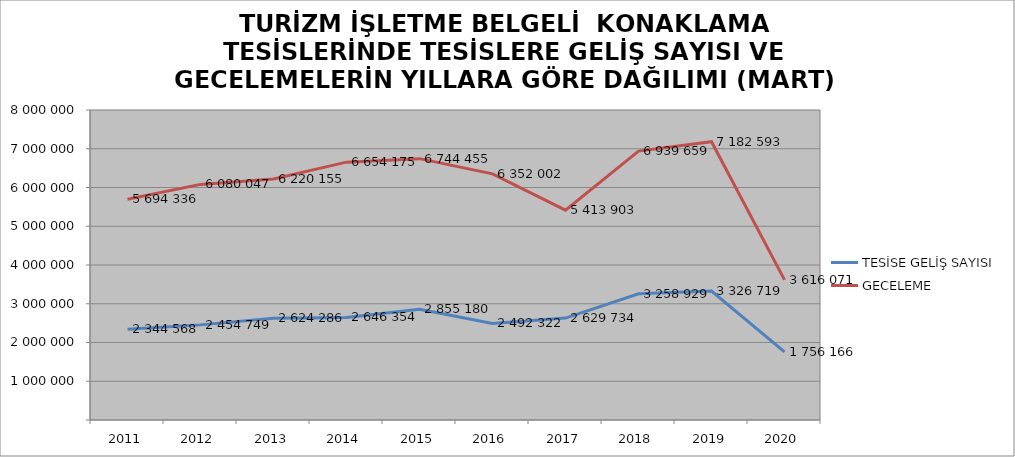
| Category | TESİSE GELİŞ SAYISI | GECELEME |
|---|---|---|
| 2011 | 2344568 | 5694336 |
| 2012 | 2454749 | 6080047 |
| 2013 | 2624286 | 6220155 |
| 2014 | 2646354 | 6654175 |
| 2015 | 2855180 | 6744455 |
| 2016 | 2492322 | 6352002 |
| 2017 | 2629734 | 5413903 |
| 2018 | 3258929 | 6939659 |
| 2019 | 3326719 | 7182593 |
| 2020 | 1756166 | 3616071 |